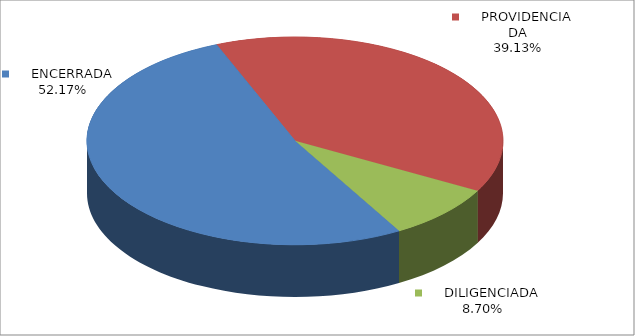
| Category | Series 0 |
|---|---|
|      ENCERRADA | 0.522 |
|      PROVIDENCIADA | 0.391 |
|      DILIGENCIADA | 0.087 |